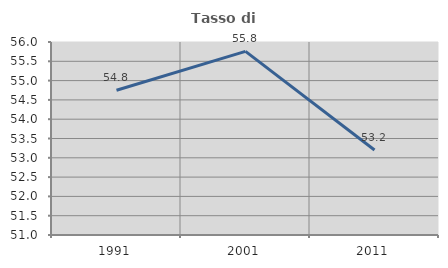
| Category | Tasso di occupazione   |
|---|---|
| 1991.0 | 54.751 |
| 2001.0 | 55.758 |
| 2011.0 | 53.203 |